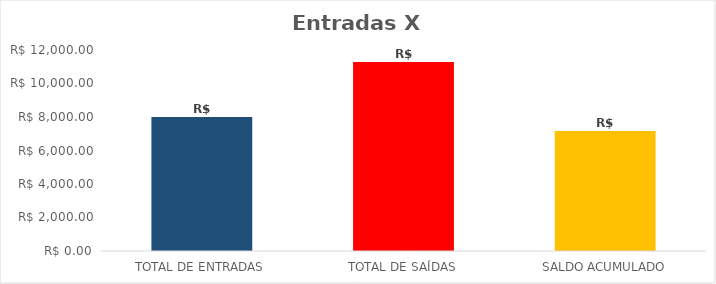
| Category | Series 0 |
|---|---|
| TOTAL DE ENTRADAS | 8000 |
| TOTAL DE SAÍDAS | 11281 |
| SALDO ACUMULADO | 7157 |